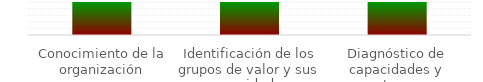
| Category | Niveles |
|---|---|
| Conocimiento de la organización | 100 |
| Identificación de los grupos de valor y sus necesidades | 100 |
| Diagnóstico de capacidades y entornos | 100 |